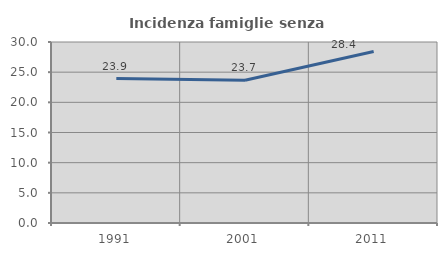
| Category | Incidenza famiglie senza nuclei |
|---|---|
| 1991.0 | 23.95 |
| 2001.0 | 23.651 |
| 2011.0 | 28.427 |